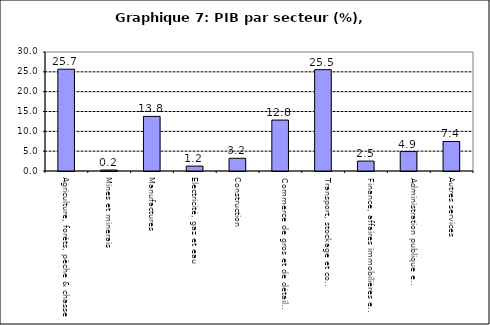
| Category | Series 0 |
|---|---|
| Agriculture, forêts, pêche & chasse | 25.667 |
| Mines et minerais | 0.246 |
| Manufactures | 13.767 |
| Electricité, gaz et eau | 1.236 |
| Construction | 3.204 |
| Commerce de gros et de détail, hôtels et restaurants | 12.837 |
| Transport, stockage et communications                | 25.543 |
| Finance, affaires immobilières et services | 2.498 |
| Administration publique et defense       | 4.905 |
| Autres services                        | 7.44 |